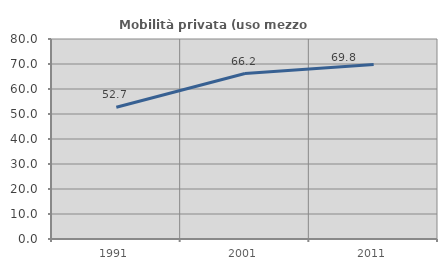
| Category | Mobilità privata (uso mezzo privato) |
|---|---|
| 1991.0 | 52.711 |
| 2001.0 | 66.181 |
| 2011.0 | 69.838 |